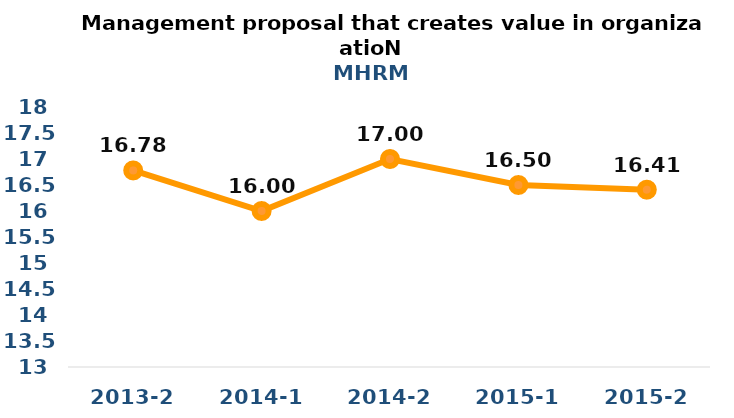
| Category | Series 0 |
|---|---|
| 2013-2 | 16.78 |
| 2014-1 | 16 |
| 2014-2 | 17 |
| 2015-1 | 16.5 |
| 2015-2 | 16.41 |